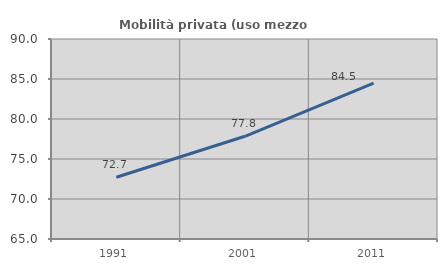
| Category | Mobilità privata (uso mezzo privato) |
|---|---|
| 1991.0 | 72.72 |
| 2001.0 | 77.84 |
| 2011.0 | 84.478 |